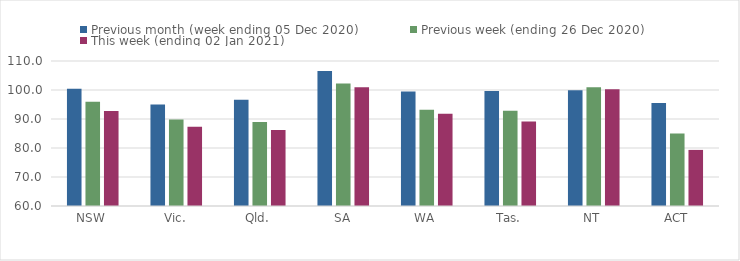
| Category | Previous month (week ending 05 Dec 2020) | Previous week (ending 26 Dec 2020) | This week (ending 02 Jan 2021) |
|---|---|---|---|
| NSW | 100.46 | 95.99 | 92.75 |
| Vic. | 95.04 | 89.8 | 87.35 |
| Qld. | 96.66 | 88.95 | 86.24 |
| SA | 106.53 | 102.28 | 100.97 |
| WA | 99.49 | 93.16 | 91.79 |
| Tas. | 99.62 | 92.88 | 89.11 |
| NT | 99.9 | 100.99 | 100.29 |
| ACT | 95.51 | 84.98 | 79.34 |